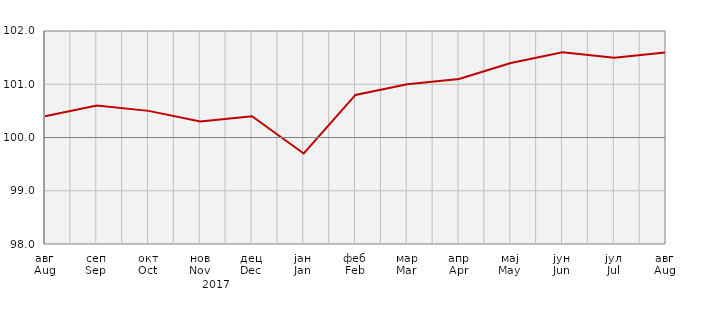
| Category | Индекси потрошачких цијена
Consumer price indices |
|---|---|
| авг
Aug | 100.4 |
| сеп
Sep | 100.6 |
| окт
Oct | 100.5 |
| нов
Nov | 100.3 |
| дец
Dec | 100.4 |
| јан
Jan | 99.7 |
| феб
Feb | 100.8 |
| мар
Mar | 101 |
| апр
Apr | 101.1 |
| мај
May | 101.4 |
| јун
Jun | 101.6 |
| јул
Jul | 101.5 |
| авг
Aug | 101.6 |